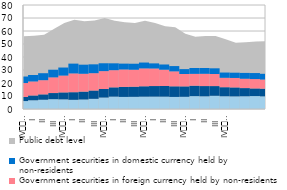
| Category | Government securities in domestic currency held by residents | Government securities in foreign currency held by residents | Government securities in foreign currency held by non-residents | Government securities in domestic currency held by non-residents |
|---|---|---|---|---|
| IV
2013 | 6.108 | 3.154 | 10.712 | 5.01 |
| I | 6.719 | 3.693 | 10.776 | 4.96 |
| II | 7.128 | 4.129 | 10.913 | 5.36 |
| III | 7.559 | 4.715 | 12.058 | 5.877 |
| IV
2014 | 7.422 | 5.345 | 12.945 | 6.191 |
| I | 7.071 | 5.857 | 14.436 | 7.542 |
| II | 7.331 | 6.037 | 13.731 | 6.995 |
| III | 7.823 | 6.394 | 13.34 | 6.803 |
| IV
2015 | 8.819 | 6.564 | 13.761 | 6.033 |
| I | 9.519 | 7.134 | 13.222 | 5.258 |
| II | 9.302 | 7.694 | 13.394 | 4.514 |
| III | 9.367 | 7.777 | 13.058 | 4.627 |
| IV
2016 | 9.497 | 7.979 | 13.754 | 4.506 |
| I | 9.526 | 8.134 | 13.489 | 3.941 |
| II | 9.502 | 8.188 | 12.532 | 4.019 |
| III | 9.291 | 8.165 | 11.493 | 4.069 |
| IV
2017 | 9.396 | 8.007 | 9.507 | 3.763 |
| I | 9.904 | 8.016 | 9.107 | 4.496 |
| II | 9.779 | 7.866 | 9.426 | 4.468 |
| III | 10.161 | 7.473 | 9.279 | 4.388 |
| IV
2018 | 9.812 | 6.953 | 7.23 | 4.052 |
| I | 9.715 | 6.884 | 7.271 | 4.056 |
| II | 9.805 | 6.277 | 7.193 | 4.476 |
| III | 9.944 | 5.871 | 7.217 | 4.626 |
| IV
2019 | 9.735 | 5.913 | 7.019 | 4.409 |